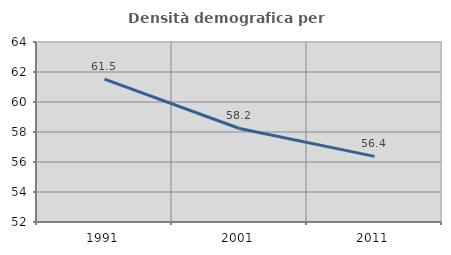
| Category | Densità demografica |
|---|---|
| 1991.0 | 61.53 |
| 2001.0 | 58.235 |
| 2011.0 | 56.376 |